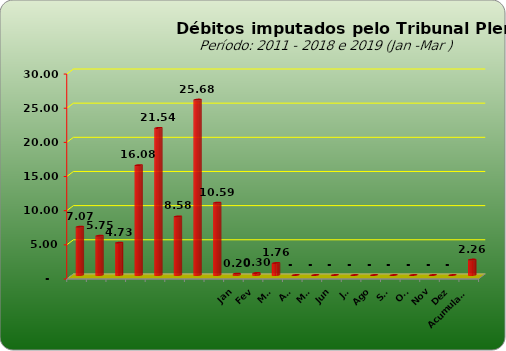
| Category |  7.073.154,74  |
|---|---|
|  | 7073154.74 |
|  | 5749129.25 |
|  | 4727033.51 |
|  | 16081820.48 |
|  | 21535723.6 |
|  | 8578266.09 |
|  | 25676499.17 |
|  | 10592915.18 |
| Jan | 197255.77 |
| Fev | 296375.09 |
| Mar | 1764671 |
| Abr | 0 |
| Mai | 0 |
| Jun | 0 |
| Jul | 0 |
| Ago | 0 |
| Set | 0 |
| Out | 0 |
| Nov | 0 |
| Dez | 0 |
| Acumulado | 2258301.86 |